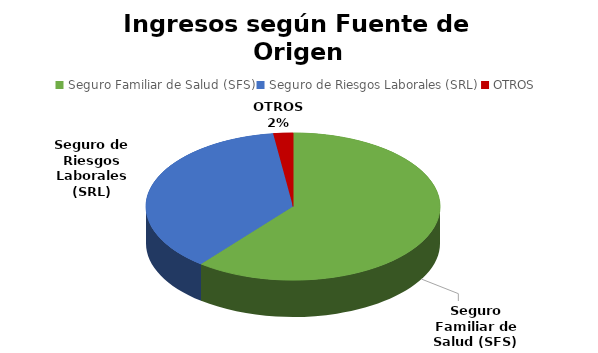
| Category | Series 0 |
|---|---|
| Seguro Familiar de Salud (SFS) | 275911264.5 |
| Seguro de Riesgos Laborales (SRL) | 168521815.1 |
| OTROS | 9774576.91 |